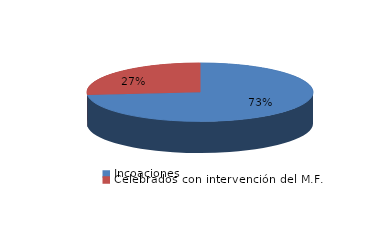
| Category | Series 0 |
|---|---|
| Incoaciones | 1280 |
| Celebrados con intervención del M.F. | 463 |